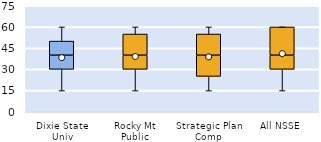
| Category | 25th | 50th | 75th |
|---|---|---|---|
| Dixie State Univ | 30 | 10 | 10 |
| Rocky Mt Public | 30 | 10 | 15 |
| Strategic Plan Comp | 25 | 15 | 15 |
| All NSSE | 30 | 10 | 20 |